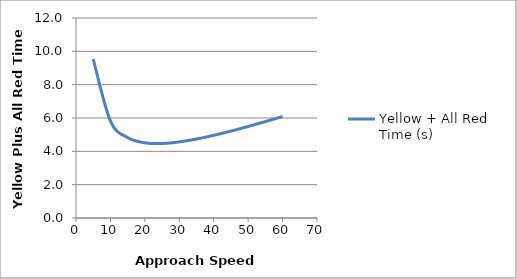
| Category | Yellow + All Red Time (s) |
|---|---|
| 5.0 | 9.531 |
| 10.0 | 5.817 |
| 15.0 | 4.824 |
| 20.0 | 4.511 |
| 25.0 | 4.47 |
| 30.0 | 4.566 |
| 35.0 | 4.739 |
| 40.0 | 4.96 |
| 45.0 | 5.215 |
| 50.0 | 5.491 |
| 55.0 | 5.785 |
| 60.0 | 6.09 |